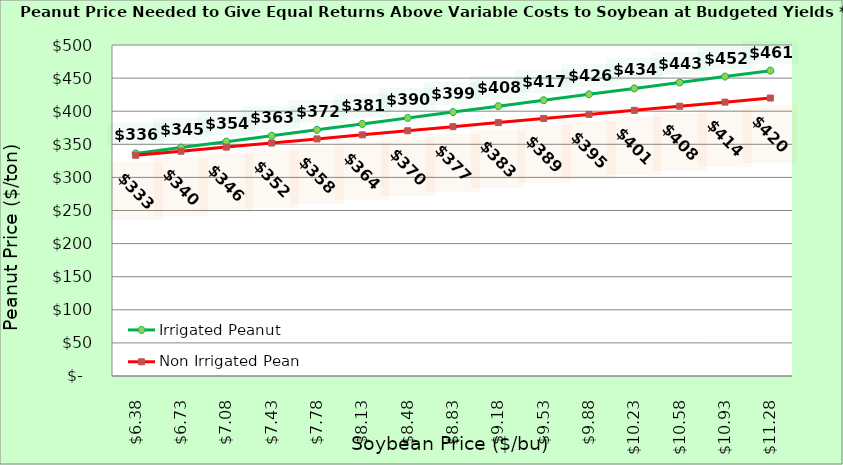
| Category | Irrigated Peanut | Non Irrigated Peanut |
|---|---|---|
| 6.380000000000003 | 336.147 | 333.395 |
| 6.730000000000002 | 345.084 | 339.572 |
| 7.080000000000002 | 354.02 | 345.748 |
| 7.4300000000000015 | 362.956 | 351.925 |
| 7.780000000000001 | 371.892 | 358.101 |
| 8.13 | 380.828 | 364.278 |
| 8.48 | 389.764 | 370.454 |
| 8.83 | 398.701 | 376.631 |
| 9.18 | 407.637 | 382.807 |
| 9.53 | 416.573 | 388.983 |
| 9.879999999999999 | 425.509 | 395.16 |
| 10.229999999999999 | 434.445 | 401.336 |
| 10.579999999999998 | 443.381 | 407.513 |
| 10.929999999999998 | 452.318 | 413.689 |
| 11.279999999999998 | 461.254 | 419.866 |